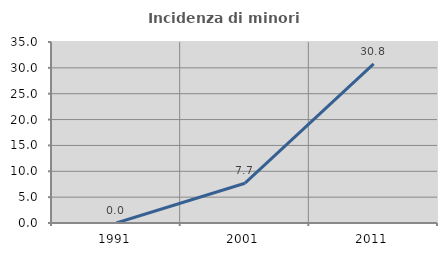
| Category | Incidenza di minori stranieri |
|---|---|
| 1991.0 | 0 |
| 2001.0 | 7.692 |
| 2011.0 | 30.769 |